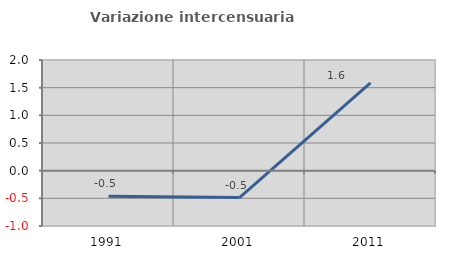
| Category | Variazione intercensuaria annua |
|---|---|
| 1991.0 | -0.463 |
| 2001.0 | -0.487 |
| 2011.0 | 1.585 |